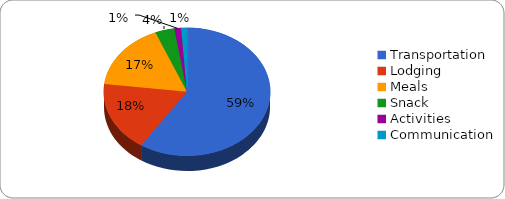
| Category | Budget |
|---|---|
| Transportation | 2592596 |
| Lodging | 775632 |
| Meals | 737102 |
| Snack | 164280.5 |
| Activities | 56320 |
| Communication | 50000 |